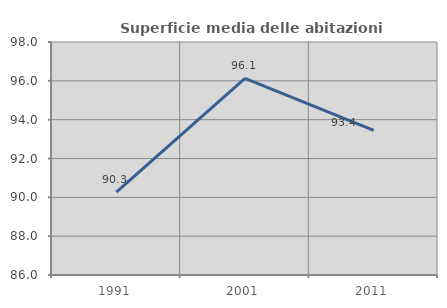
| Category | Superficie media delle abitazioni occupate |
|---|---|
| 1991.0 | 90.272 |
| 2001.0 | 96.126 |
| 2011.0 | 93.444 |